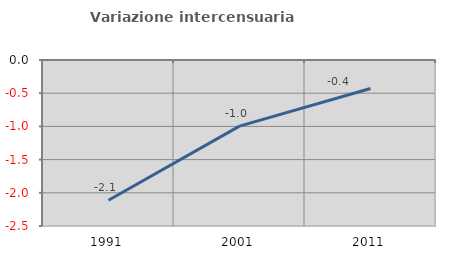
| Category | Variazione intercensuaria annua |
|---|---|
| 1991.0 | -2.113 |
| 2001.0 | -0.996 |
| 2011.0 | -0.429 |